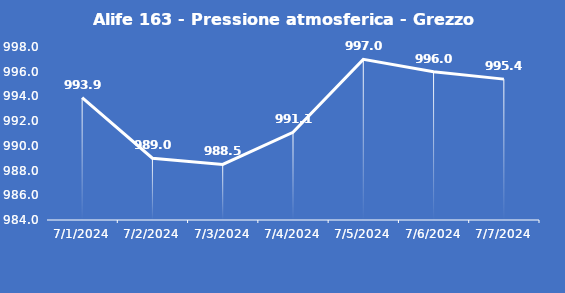
| Category | Alife 163 - Pressione atmosferica - Grezzo (hPa) |
|---|---|
| 7/1/24 | 993.9 |
| 7/2/24 | 989 |
| 7/3/24 | 988.5 |
| 7/4/24 | 991.1 |
| 7/5/24 | 997 |
| 7/6/24 | 996 |
| 7/7/24 | 995.4 |